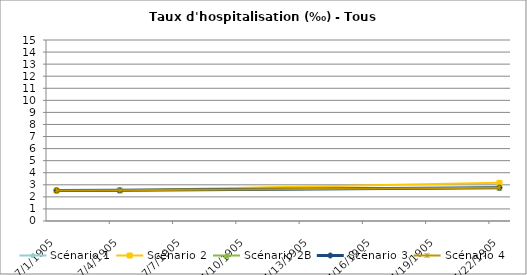
| Category | Scénario 1 | Scénario 2 | Scénario 2B | Scénario 3 | Scénario 4 |
|---|---|---|---|---|---|
| 2009.0 | 2.535 | 2.535 | 2.535 | 2.535 | 2.535 |
| 2012.0 | 2.542 | 2.542 | 2.542 | 2.542 | 2.542 |
| 2030.0 | 2.763 | 3.163 | 2.763 | 2.763 | 2.763 |